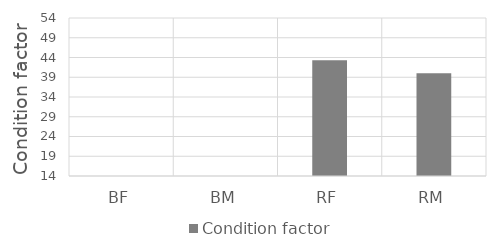
| Category | Condition factor |
|---|---|
| BF | 0 |
| BM | 0 |
| RF | 43.3 |
| RM | 40 |